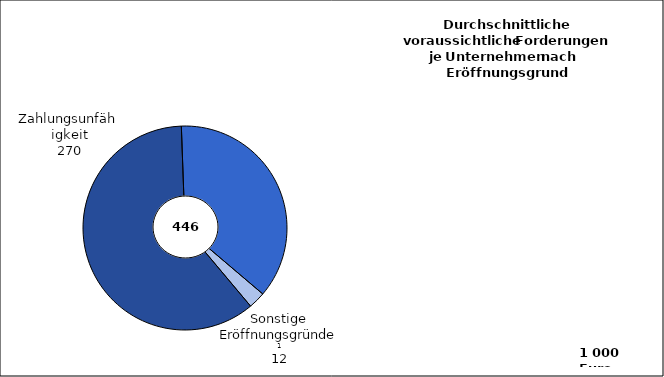
| Category | Series 0 | Series 1 |
|---|---|---|
| Zahlungsunfähigkeit | 270 | 308 |
|   Zahlungsunfähigkeit
   und Überschuldung | 164 | 2367 |
|   Sonstige Eröffnungs-
                      gründe  2 | 12 | 220 |